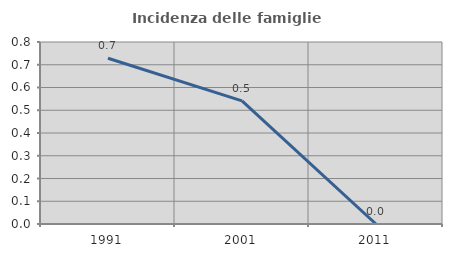
| Category | Incidenza delle famiglie numerose |
|---|---|
| 1991.0 | 0.729 |
| 2001.0 | 0.542 |
| 2011.0 | 0 |